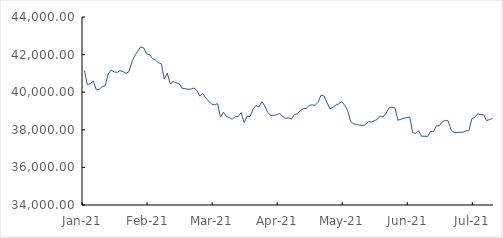
| Category | Series 0 |
|---|---|
| Jan-21 | 41147.39 |
| Jan-21 | 40396.14 |
| Jan-21 | 40465.15 |
| Jan-21 | 40590.85 |
| Jan-21 | 40120.22 |
| Jan-21 | 40150.78 |
| Jan-21 | 40295.95 |
| Jan-21 | 40341.05 |
| Jan-21 | 40963.14 |
| Jan-21 | 41176.14 |
| Jan-21 | 41082.38 |
| Jan-21 | 41051.63 |
| Jan-21 | 41147.72 |
| Jan-21 | 41099.15 |
| Jan-21 | 41001.99 |
| Jan-21 | 41088.96 |
| Jan-21 | 41584.94 |
| Jan-21 | 41930.73 |
| Jan-21 | 42169.41 |
| Jan-21 | 42412.66 |
| Feb-21 | 42357.9 |
| Feb-21 | 42043.79 |
| Feb-21 | 42000.01 |
| Feb-21 | 41785.8 |
| Feb-21 | 41709.09 |
| Feb-21 | 41564.31 |
| Feb-21 | 41510.16 |
| Feb-21 | 40696.01 |
| Feb-21 | 41014.3 |
| Feb-21 | 40439.85 |
| Feb-21 | 40573.31 |
| Feb-21 | 40494.35 |
| Feb-21 | 40465.32 |
| Feb-21 | 40212.19 |
| Feb-21 | 40186.7 |
| Feb-21 | 40154.09 |
| Feb-21 | 40164.86 |
| Feb-21 | 40221.3 |
| Feb-21 | 40095.49 |
| Feb-21 | 39799.89 |
| Mar-21 | 39931.63 |
| Mar-21 | 39697.62 |
| Mar-21 | 39522.06 |
| Mar-21 | 39364.67 |
| Mar-21 | 39331.61 |
| Mar-21 | 39396.57 |
| Mar-21 | 38686.85 |
| Mar-21 | 38931.25 |
| Mar-21 | 38707.87 |
| Mar-21 | 38648.48 |
| Mar-21 | 38561.84 |
| Mar-21 | 38720.81 |
| Mar-21 | 38706.13 |
| Mar-21 | 38914.84 |
| Mar-21 | 38382.39 |
| Mar-21 | 38722.87 |
| Mar-21 | 38704.97 |
| Mar-21 | 39085.78 |
| Mar-21 | 39293.14 |
| Mar-21 | 39216.2 |
| Mar-21 | 39493.37 |
| Mar-21 | 39267.11 |
| Apr-21 | 38916.74 |
| Apr-21 | 38766.61 |
| Apr-21 | 38774.03 |
| Apr-21 | 38799.83 |
| Apr-21 | 38866.39 |
| Apr-21 | 38712.55 |
| Apr-21 | 38601.83 |
| Apr-21 | 38636.15 |
| Apr-21 | 38571.89 |
| Apr-21 | 38808.01 |
| Apr-21 | 38848.02 |
| Apr-21 | 39015.58 |
| Apr-21 | 39128.34 |
| Apr-21 | 39131.8 |
| Apr-21 | 39301.82 |
| Apr-21 | 39318.52 |
| Apr-21 | 39303.09 |
| Apr-21 | 39461.2 |
| Apr-21 | 39840.28 |
| May-21 | 39801.78 |
| May-21 | 39456.64 |
| May-21 | 39114.73 |
| May-21 | 39198.75 |
| May-21 | 39312.74 |
| May-21 | 39382.96 |
| May-21 | 39494.7 |
| May-21 | 39306.47 |
| May-21 | 39022.52 |
| May-21 | 38445.09 |
| May-21 | 38324.07 |
| May-21 | 38287.58 |
| May-21 | 38256.76 |
| May-21 | 38233.68 |
| May-21 | 38256.95 |
| May-21 | 38437.88 |
| Jun-21 | 38414.37 |
| Jun-21 | 38482.52 |
| Jun-21 | 38551.06 |
| Jun-21 | 38726.1 |
| Jun-21 | 38688.98 |
| Jun-21 | 38881.7 |
| Jun-21 | 39170.95 |
| Jun-21 | 39210.1 |
| Jun-21 | 39157.29 |
| Jun-21 | 38507.33 |
| Jun-21 | 38564.7 |
| Jun-21 | 38615.11 |
| Jun-21 | 38648.91 |
| Jun-21 | 38678.48 |
| Jun-21 | 37847.07 |
| Jun-21 | 37804.46 |
| Jun-21 | 37954.35 |
| Jun-21 | 37658.26 |
| Jun-21 | 37658.26 |
| Jun-21 | 37640.75 |
| Jun-21 | 37907.28 |
| Jul-21 | 37898.59 |
| Jul-21 | 38212.01 |
| Jul-21 | 38222.01 |
| Jul-21 | 38418.04 |
| Jul-21 | 38501.31 |
| Jul-21 | 38470.87 |
| Jul-21 | 37994.19 |
| Jul-21 | 37857.89 |
| Jul-21 | 37857.24 |
| Jul-21 | 37872.55 |
| Jul-21 | 37866.9 |
| Jul-21 | 37947.18 |
| Jul-21 | 37952.65 |
| Jul-21 | 38585.52 |
| Jul-21 | 38667.9 |
| Jul-21 | 38849.08 |
| Jul-21 | 38813.36 |
| Jul-21 | 38791.03 |
| Jul-21 | 38484.82 |
| Jul-21 | 38547.08 |
| Aug-21 | 38604.72 |